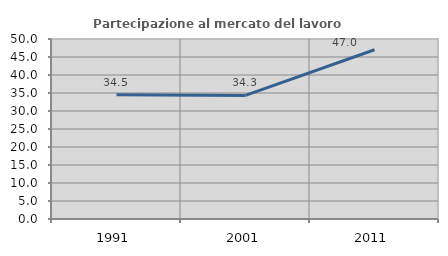
| Category | Partecipazione al mercato del lavoro  femminile |
|---|---|
| 1991.0 | 34.495 |
| 2001.0 | 34.323 |
| 2011.0 | 47.011 |